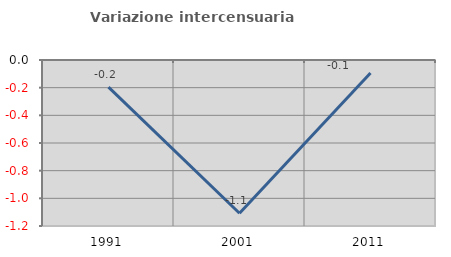
| Category | Variazione intercensuaria annua |
|---|---|
| 1991.0 | -0.196 |
| 2001.0 | -1.108 |
| 2011.0 | -0.094 |